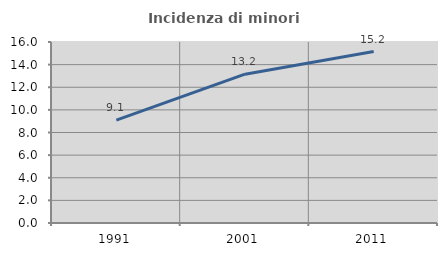
| Category | Incidenza di minori stranieri |
|---|---|
| 1991.0 | 9.091 |
| 2001.0 | 13.158 |
| 2011.0 | 15.152 |